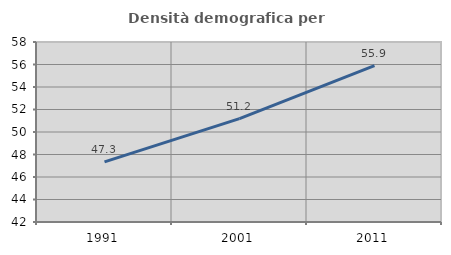
| Category | Densità demografica |
|---|---|
| 1991.0 | 47.349 |
| 2001.0 | 51.189 |
| 2011.0 | 55.893 |